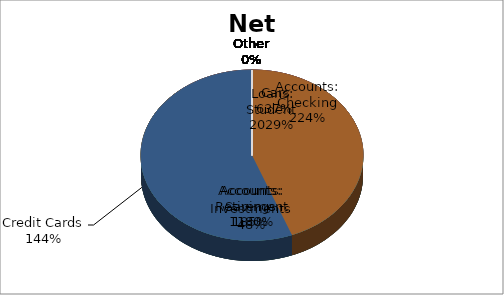
| Category | Category |
|---|---|
| Accounts: Savings | 2321.28 |
| Accounts: Checking | 2812.61 |
| Accounts: Retirement | 14824.36 |
| Cars | 8000 |
| Investments | 600 |
| Loans: Student | -25491.12 |
| Credit Cards | -1810.93 |